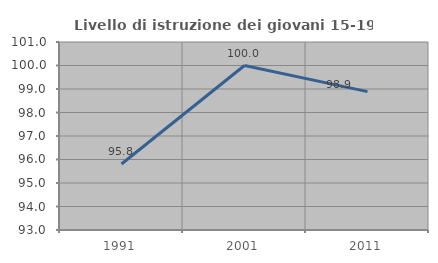
| Category | Livello di istruzione dei giovani 15-19 anni |
|---|---|
| 1991.0 | 95.808 |
| 2001.0 | 100 |
| 2011.0 | 98.889 |